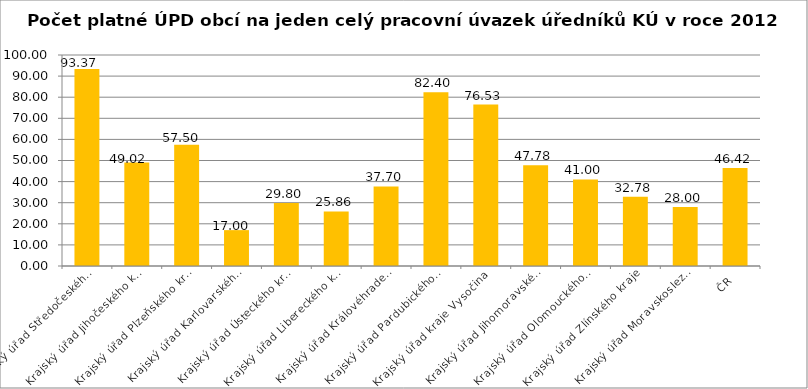
| Category | Počet platné ÚPD obcí na jeden celý pracovní úvazek úředníků KÚ |
|---|---|
| Krajský úřad Středočeského kraje | 93.368 |
| Krajský úřad Jihočeského kraje | 49.023 |
| Krajský úřad Plzeňského kraje | 57.5 |
| Krajský úřad Karlovarského kraje | 17 |
| Krajský úřad Ústeckého kraje | 29.8 |
| Krajský úřad Libereckého kraje | 25.857 |
| Krajský úřad Královéhradeckého kraje | 37.7 |
| Krajský úřad Pardubického kraje | 82.4 |
| Krajský úřad kraje Vysočina | 76.533 |
| Krajský úřad Jihomoravského kraje | 47.778 |
| Krajský úřad Olomouckého kraje | 41 |
| Krajský úřad Zlínského kraje | 32.778 |
| Krajský úřad Moravskoslezského kraje | 28 |
| ČR | 46.417 |